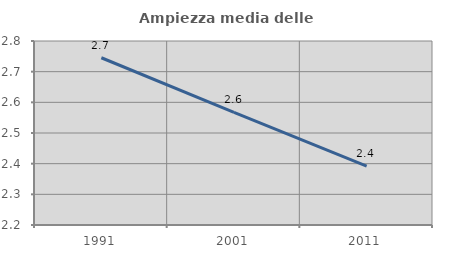
| Category | Ampiezza media delle famiglie |
|---|---|
| 1991.0 | 2.745 |
| 2001.0 | 2.567 |
| 2011.0 | 2.392 |